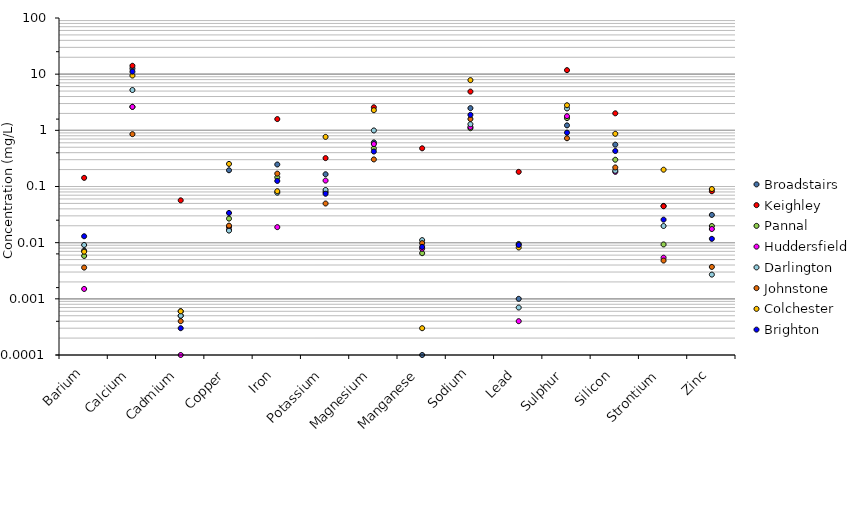
| Category | Broadstairs | Keighley | Pannal | Huddersfield | Darlington | Johnstone | Colchester | Brighton |
|---|---|---|---|---|---|---|---|---|
| Barium | 0.007 | 0.142 | 0.006 | 0.002 | 0.009 | 0.004 | 0.007 | 0.013 |
| Calcium | 12.62 | 14.11 | 2.622 | 2.616 | 5.223 | 0.855 | 9.441 | 11.09 |
| Cadmium | 0 | 0.057 | 0.001 | 0 | 0 | 0 | 0.001 | 0 |
| Copper | 0.194 | 0.019 | 0.027 | 0.017 | 0.016 | 0.02 | 0.252 | 0.034 |
| Iron | 0.247 | 1.586 | 0.146 | 0.019 | 0.078 | 0.17 | 0.082 | 0.126 |
| Potassium | 0.165 | 0.32 | 0.08 | 0.127 | 0.087 | 0.05 | 0.764 | 0.074 |
| Magnesium | 0.61 | 2.572 | 0.476 | 0.57 | 0.995 | 0.304 | 2.284 | 0.42 |
| Manganese | 0 | 0.479 | 0.006 | 0.008 | 0.011 | 0.01 | 0 | 0.008 |
| Sodium | 2.483 | 4.895 | 1.09 | 1.147 | 1.285 | 1.592 | 7.829 | 1.885 |
| Lead | 0.001 | 0.182 | 0.01 | 0 | 0.001 | 0 | 0.008 | 0.009 |
| Sulphur | 1.226 | 11.79 | 1.647 | 1.786 | 2.452 | 0.723 | 2.795 | 0.91 |
| Silicon | 0.556 | 2.008 | 0.3 | 0.182 | 0.191 | 0.218 | 0.867 | 0.429 |
| Strontium | 0.045 | 0.044 | 0.009 | 0.005 | 0.02 | 0.005 | 0.199 | 0.026 |
| Zinc | 0.031 | 0.082 | 0.02 | 0.018 | 0.003 | 0.004 | 0.09 | 0.012 |